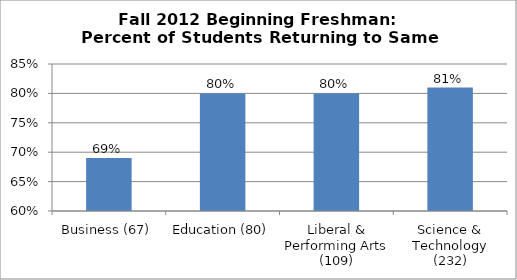
| Category | Series 0 |
|---|---|
| Business (67) | 0.69 |
| Education (80) | 0.8 |
| Liberal & Performing Arts (109) | 0.8 |
| Science & Technology (232) | 0.81 |